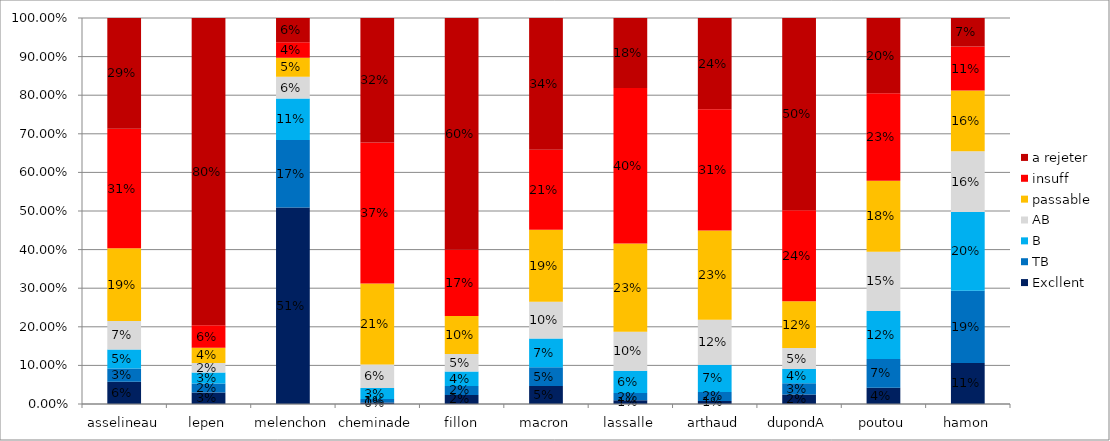
| Category | Excllent | TB | B | AB | passable | insuff | a rejeter |
|---|---|---|---|---|---|---|---|
| asselineau | 0.058 | 0.034 | 0.049 | 0.074 | 0.189 | 0.309 | 0.287 |
| lepen | 0.03 | 0.023 | 0.029 | 0.025 | 0.039 | 0.058 | 0.796 |
| melenchon | 0.509 | 0.175 | 0.107 | 0.056 | 0.049 | 0.04 | 0.063 |
| cheminade | 0.004 | 0.009 | 0.028 | 0.061 | 0.21 | 0.365 | 0.322 |
| fillon | 0.024 | 0.023 | 0.038 | 0.045 | 0.098 | 0.171 | 0.601 |
| macron | 0.047 | 0.049 | 0.075 | 0.095 | 0.186 | 0.208 | 0.341 |
| lassalle | 0.01 | 0.019 | 0.057 | 0.101 | 0.228 | 0.403 | 0.181 |
| arthaud | 0.008 | 0.023 | 0.071 | 0.116 | 0.231 | 0.314 | 0.237 |
| dupondA | 0.025 | 0.029 | 0.037 | 0.054 | 0.121 | 0.236 | 0.498 |
| poutou | 0.042 | 0.074 | 0.124 | 0.154 | 0.184 | 0.226 | 0.195 |
| hamon | 0.106 | 0.187 | 0.204 | 0.157 | 0.157 | 0.114 | 0.074 |